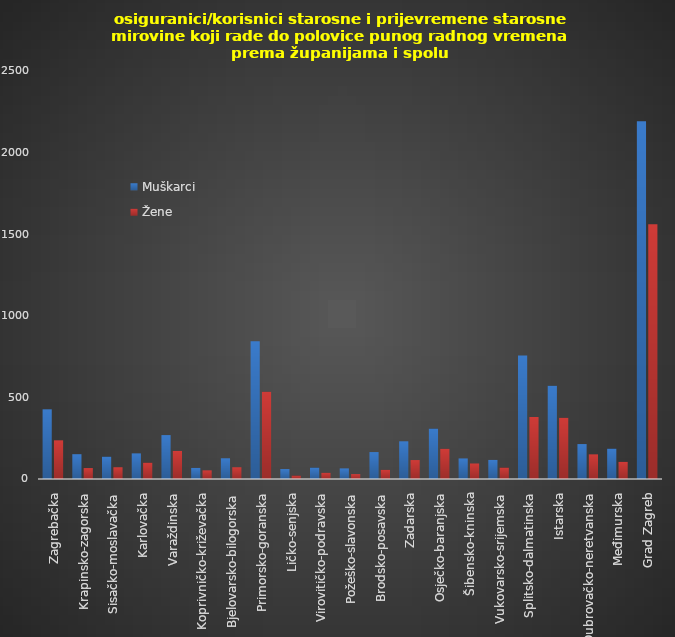
| Category | Muškarci | Žene |
|---|---|---|
| Zagrebačka | 427 | 237 |
| Krapinsko-zagorska | 152 | 67 |
| Sisačko-moslavačka | 137 | 72 |
| Karlovačka | 157 | 100 |
| Varaždinska | 269 | 172 |
| Koprivničko-križevačka | 68 | 53 |
| Bjelovarsko-bilogorska | 127 | 72 |
| Primorsko-goranska | 844 | 535 |
| Ličko-senjska | 61 | 21 |
| Virovitičko-podravska | 70 | 38 |
| Požeško-slavonska | 65 | 30 |
| Brodsko-posavska | 165 | 56 |
| Zadarska | 231 | 116 |
| Osječko-baranjska | 309 | 185 |
| Šibensko-kninska | 126 | 95 |
| Vukovarsko-srijemska | 117 | 70 |
| Splitsko-dalmatinska | 757 | 380 |
| Istarska | 572 | 375 |
| Dubrovačko-neretvanska | 214 | 151 |
| Međimurska | 186 | 105 |
| Grad Zagreb | 2192 | 1561 |